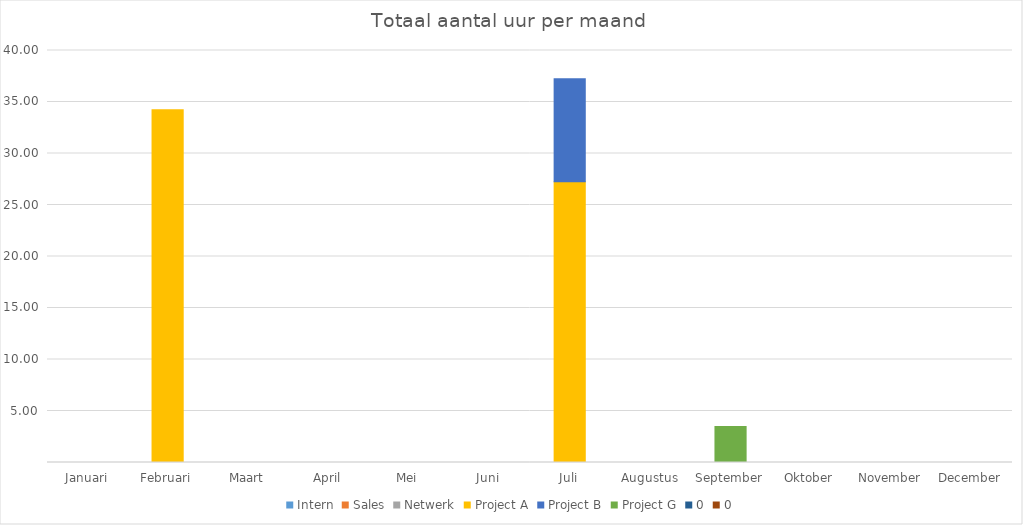
| Category | Intern | Sales | Netwerk | Project A | Project B | Project G | 0 |
|---|---|---|---|---|---|---|---|
| Januari | 0 | 0 | 0 | 0 | 0 | 0 | 0 |
| Februari | 0 | 0 | 0 | 34.25 | 0 | 0 | 0 |
| Maart | 0 | 0 | 0 | 0 | 0 | 0 | 0 |
| April | 0 | 0 | 0 | 0 | 0 | 0 | 0 |
| Mei | 0 | 0 | 0 | 0 | 0 | 0 | 0 |
| Juni | 0 | 0 | 0 | 0 | 0 | 0 | 0 |
| Juli | 0 | 0 | 0 | 27.25 | 10 | 0 | 0 |
| Augustus | 0 | 0 | 0 | 0 | 0 | 0 | 0 |
| September | 0 | 0 | 0 | 0 | 0 | 3.5 | 0 |
| Oktober | 0 | 0 | 0 | 0 | 0 | 0 | 0 |
| November | 0 | 0 | 0 | 0 | 0 | 0 | 0 |
| December | 0 | 0 | 0 | 0 | 0 | 0 | 0 |